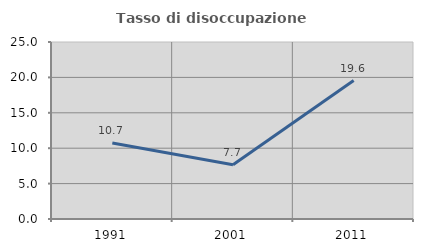
| Category | Tasso di disoccupazione giovanile  |
|---|---|
| 1991.0 | 10.734 |
| 2001.0 | 7.653 |
| 2011.0 | 19.558 |